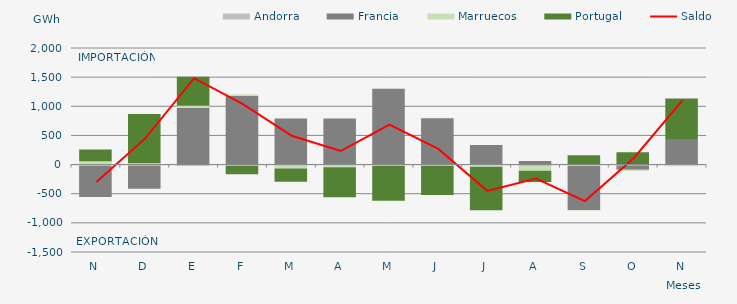
| Category | Andorra | Francia | Marruecos | Portugal |
|---|---|---|---|---|
| N | -22.557 | -531.947 | 57.949 | 199.161 |
| D | -20.764 | -396.046 | 21.949 | 843.669 |
| E | -24.438 | 973.605 | 35.757 | 497.454 |
| F | -19.197 | 1176.23 | 25.948 | -147.199 |
| M | -22.309 | 789.686 | -47.202 | -226.399 |
| A | -6.988 | 791.615 | -38.41 | -513.779 |
| M | -1.245 | 1302.344 | -18.608 | -598.82 |
| J | -0.008 | 792.83 | -21.038 | -502.886 |
| J | -5.052 | 334.729 | -33.385 | -747.138 |
| A | -26.107 | 60.563 | -80.137 | -193.987 |
| S | -25.668 | -754.78 | -5.797 | 160.618 |
| O | -15.157 | -73.766 | -16.017 | 213.105 |
| N | -15.095 | 437.908 | -13.351 | 696.98 |